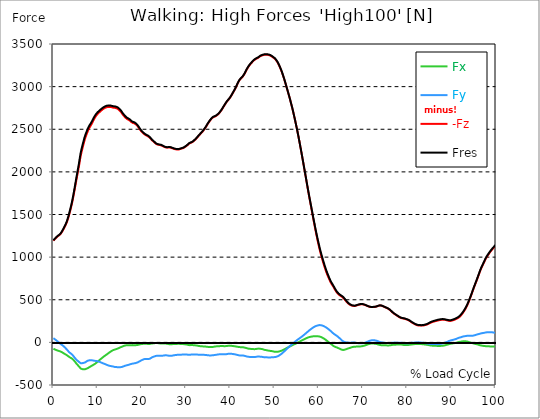
| Category |  Fx |  Fy |  -Fz |  Fres |
|---|---|---|---|---|
| 0.0 | -74.852 | 49.614 | 1192.858 | 1197.875 |
| 0.1647276845464841 | -78.674 | 42.86 | 1202.476 | 1207.298 |
| 0.3294553690929682 | -82.621 | 36.189 | 1210.884 | 1215.762 |
| 0.5044785339236075 | -86.387 | 29.838 | 1220.278 | 1225.226 |
| 0.6692062184700917 | -90.056 | 23.626 | 1230.09 | 1235.121 |
| 0.8339339030165757 | -93.517 | 16.302 | 1237.803 | 1242.945 |
| 0.9986615875630598 | -96.741 | 8.408 | 1245.294 | 1250.631 |
| 1.1633892721095438 | -99.965 | 0.264 | 1251.979 | 1257.468 |
| 1.3384124369401833 | -102.397 | -6.518 | 1256.899 | 1262.597 |
| 1.5031401214866673 | -105.163 | -12.814 | 1264.473 | 1270.49 |
| 1.6678678060331513 | -108.304 | -19.762 | 1273.742 | 1280.121 |
| 1.8325954905796356 | -112.293 | -26.531 | 1285.041 | 1291.768 |
| 1.9973231751261196 | -117.046 | -32.034 | 1300.579 | 1307.722 |
| 2.1620508596726036 | -122.771 | -38.594 | 1316.311 | 1323.927 |
| 2.337074024503243 | -128.344 | -45.932 | 1332.098 | 1340.242 |
| 2.501801709049727 | -133.5 | -54.089 | 1348.206 | 1356.947 |
| 2.666529393596211 | -138.295 | -62.692 | 1364.702 | 1374.041 |
| 2.8312570781426953 | -143.451 | -71.864 | 1383.339 | 1393.512 |
| 2.9959847626891793 | -148.704 | -81.176 | 1403.046 | 1414.108 |
| 3.1710079275198186 | -154.305 | -90.362 | 1427.116 | 1439.124 |
| 3.3357356120663026 | -161.073 | -100.549 | 1455.412 | 1468.462 |
| 3.500463296612787 | -168.536 | -112.32 | 1483.666 | 1497.98 |
| 3.665190981159271 | -174.165 | -119.908 | 1516.269 | 1531.459 |
| 3.8299186657057547 | -178.64 | -126.065 | 1549.79 | 1565.703 |
| 4.004941830536394 | -183.281 | -132.347 | 1584.34 | 1601.003 |
| 4.169669515082878 | -188.16 | -138.726 | 1620.446 | 1637.873 |
| 4.334397199629363 | -194.872 | -147.773 | 1661.013 | 1679.58 |
| 4.499124884175846 | -203.002 | -158.585 | 1704.679 | 1724.692 |
| 4.663852568722331 | -213.3 | -170.051 | 1750.722 | 1772.541 |
| 4.8285802532688145 | -223.251 | -180.53 | 1797.279 | 1820.738 |
| 5.003603418099454 | -234.174 | -190.439 | 1846.004 | 1871.228 |
| 5.168331102645938 | -246.043 | -201.126 | 1894.937 | 1922.079 |
| 5.333058787192422 | -255.966 | -209.228 | 1941.091 | 1969.692 |
| 5.497786471738906 | -265.764 | -216.413 | 1987.342 | 2017.333 |
| 5.662514156285391 | -275.242 | -223.154 | 2033.427 | 2064.71 |
| 5.83753732111603 | -285.137 | -230.533 | 2081.429 | 2114.088 |
| 6.0022650056625135 | -296.561 | -238.622 | 2136.116 | 2170.262 |
| 6.166992690208998 | -305.636 | -244.348 | 2185.063 | 2220.349 |
| 6.331720374755482 | -310.041 | -245.07 | 2225.061 | 2260.458 |
| 6.496448059301967 | -313.405 | -244.473 | 2261.458 | 2296.731 |
| 6.671471224132605 | -314.989 | -242.332 | 2294.59 | 2329.487 |
| 6.836198908679089 | -315.684 | -240.373 | 2327.847 | 2362.174 |
| 7.000926593225574 | -316.559 | -238.677 | 2361.73 | 2395.542 |
| 7.165654277772057 | -315.573 | -235.258 | 2390.859 | 2423.796 |
| 7.330381962318542 | -312.64 | -230.158 | 2415.583 | 2447.325 |
| 7.495109646865026 | -308.332 | -223.473 | 2439.236 | 2469.505 |
| 7.670132811695664 | -304.149 | -217.47 | 2462.362 | 2491.269 |
| 7.8348604962421495 | -300.369 | -213.648 | 2483.681 | 2511.601 |
| 7.999588180788634 | -295.588 | -211.452 | 2502.665 | 2529.682 |
| 8.164315865335118 | -290.126 | -210.507 | 2519.134 | 2545.345 |
| 8.329043549881602 | -284.817 | -209.604 | 2533.143 | 2558.603 |
| 8.504066714712243 | -279.842 | -209.659 | 2547.721 | 2572.556 |
| 8.668794399258726 | -275.047 | -210.618 | 2563.87 | 2588.163 |
| 8.833522083805208 | -269.919 | -211.007 | 2581.52 | 2605.132 |
| 8.998249768351693 | -265.041 | -212.883 | 2599.073 | 2622.17 |
| 9.162977452898177 | -260.107 | -214.954 | 2615.736 | 2638.375 |
| 9.338000617728817 | -254.715 | -216.316 | 2631.134 | 2653.232 |
| 9.5027283022753 | -248.781 | -217.136 | 2645.129 | 2666.615 |
| 9.667455986821786 | -242.471 | -218.623 | 2658.263 | 2679.192 |
| 9.83218367136827 | -235.078 | -220.082 | 2669.353 | 2689.685 |
| 9.996911355914754 | -227.365 | -221.792 | 2679.109 | 2698.885 |
| 10.171934520745392 | -219.582 | -223.751 | 2687.837 | 2707.126 |
| 10.336662205291876 | -211.869 | -226.03 | 2696.314 | 2715.145 |
| 10.501389889838359 | -204.295 | -228.713 | 2704.681 | 2723.081 |
| 10.666117574384844 | -197.151 | -232.576 | 2712.644 | 2730.78 |
| 10.830845258931328 | -190.202 | -236.996 | 2720.176 | 2738.132 |
| 10.995572943477812 | -183.17 | -241.026 | 2727.222 | 2744.984 |
| 11.170596108308452 | -176.124 | -244.695 | 2733.963 | 2751.529 |
| 11.335323792854936 | -169.05 | -248.072 | 2740.647 | 2757.992 |
| 11.50005147740142 | -162.366 | -250.81 | 2745.956 | 2763.106 |
| 11.664779161947905 | -156.195 | -254.076 | 2750.473 | 2767.512 |
| 11.829506846494388 | -150.233 | -257.884 | 2754.879 | 2771.875 |
| 12.004530011325027 | -144.313 | -261.997 | 2757.686 | 2774.738 |
| 12.169257695871512 | -137.878 | -265.611 | 2759.59 | 2776.628 |
| 12.333985380417996 | -131.499 | -268.932 | 2761.049 | 2778.06 |
| 12.498713064964479 | -124.842 | -271.879 | 2761.994 | 2778.935 |
| 12.663440749510965 | -118.227 | -274.491 | 2762.411 | 2779.241 |
| 12.838463914341604 | -112.223 | -276.381 | 2762.022 | 2778.755 |
| 13.003191598888087 | -106.595 | -277.577 | 2760.743 | 2777.337 |
| 13.167919283434573 | -101.049 | -279.675 | 2758.534 | 2775.114 |
| 13.332646967981058 | -95.824 | -280.592 | 2756.116 | 2772.584 |
| 13.497374652527538 | -91.113 | -282.705 | 2753.961 | 2770.486 |
| 13.662102337074025 | -87.805 | -285.471 | 2752.544 | 2769.235 |
| 13.837125501904662 | -85.081 | -288.222 | 2751.946 | 2768.818 |
| 14.001853186451148 | -82.566 | -289.251 | 2750.237 | 2767.164 |
| 14.166580870997631 | -79.911 | -290.182 | 2748.18 | 2765.121 |
| 14.331308555544114 | -76.576 | -291.196 | 2744.942 | 2761.911 |
| 14.4960362400906 | -73.796 | -290.488 | 2740.675 | 2757.505 |
| 14.671059404921238 | -71.114 | -291.196 | 2735.394 | 2752.252 |
| 14.835787089467724 | -66 | -291.488 | 2727.653 | 2744.414 |
| 15.000514774014206 | -60.594 | -291.683 | 2719.481 | 2736.145 |
| 15.165242458560689 | -57.619 | -291.002 | 2709.475 | 2726.055 |
| 15.329970143107175 | -54.645 | -290.307 | 2699.455 | 2715.951 |
| 15.504993307937815 | -50.629 | -288.042 | 2686.697 | 2702.943 |
| 15.669720992484299 | -46.821 | -285.54 | 2674.134 | 2690.102 |
| 15.834448677030782 | -43.625 | -282.01 | 2663.099 | 2678.678 |
| 15.999176361577268 | -40.72 | -277.952 | 2653.079 | 2668.241 |
| 16.16390404612375 | -37.259 | -274.964 | 2643.531 | 2658.374 |
| 16.33892721095439 | -35.036 | -272.393 | 2634.79 | 2649.382 |
| 16.503654895500876 | -34.355 | -270.169 | 2626.687 | 2641.085 |
| 16.668382580047357 | -34.369 | -268.349 | 2620.197 | 2634.456 |
| 16.833110264593845 | -34.258 | -265.68 | 2615.333 | 2629.369 |
| 16.997837949140326 | -34.549 | -262.998 | 2611.372 | 2625.186 |
| 17.16256563368681 | -34.813 | -260.427 | 2606.897 | 2620.503 |
| 17.33758879851745 | -34.661 | -258.009 | 2600.157 | 2613.54 |
| 17.502316483063932 | -34.341 | -254.771 | 2591.971 | 2605.09 |
| 17.667044167610417 | -32.923 | -251.936 | 2583.48 | 2596.349 |
| 17.8317718521569 | -32.131 | -249.809 | 2578.004 | 2590.665 |
| 17.996499536703386 | -32.91 | -247.655 | 2573.807 | 2586.287 |
| 18.171522701534023 | -33.882 | -246.932 | 2570.93 | 2583.382 |
| 18.33625038608051 | -34.869 | -246.919 | 2568.901 | 2581.395 |
| 18.500978070626992 | -34.271 | -244.153 | 2562.758 | 2575.016 |
| 18.665705755173477 | -33.34 | -241.234 | 2556.213 | 2568.22 |
| 18.83043343971996 | -31.506 | -238.844 | 2549.361 | 2561.132 |
| 19.0054566045506 | -30.422 | -235.592 | 2539.41 | 2550.931 |
| 19.170184289097087 | -28.865 | -231.895 | 2527.639 | 2538.854 |
| 19.33491197364357 | -27.114 | -227.643 | 2515.298 | 2526.166 |
| 19.499639658190056 | -24.279 | -222.084 | 2502.234 | 2512.616 |
| 19.66436734273654 | -21.917 | -217.094 | 2490.143 | 2500.094 |
| 19.82909502728302 | -20.402 | -212.675 | 2479.192 | 2488.781 |
| 20.004118192113662 | -19.345 | -208.603 | 2469.63 | 2478.872 |
| 20.168845876660146 | -18.025 | -204.267 | 2460.597 | 2469.478 |
| 20.33357356120663 | -17.011 | -200.139 | 2452.397 | 2460.958 |
| 20.49830124575311 | -15.913 | -196.901 | 2445.463 | 2453.773 |
| 20.663028930299596 | -15.065 | -194.928 | 2438.861 | 2447.005 |
| 20.838052095130234 | -14.523 | -194.747 | 2432.552 | 2440.682 |
| 21.002779779676718 | -15.649 | -195.094 | 2427.743 | 2435.915 |
| 21.167507464223206 | -17.066 | -195.789 | 2423.213 | 2431.482 |
| 21.332235148769687 | -18.498 | -196.72 | 2418.89 | 2427.243 |
| 21.496962833316175 | -19.165 | -196.095 | 2413.484 | 2421.809 |
| 21.671985998146813 | -19.123 | -194.274 | 2406.827 | 2415.013 |
| 21.836713682693297 | -18.122 | -191.161 | 2398.419 | 2406.383 |
| 22.00144136723978 | -16.566 | -186.631 | 2388.844 | 2396.46 |
| 22.166169051786262 | -14.078 | -180.294 | 2378.587 | 2385.717 |
| 22.33089673633275 | -12.285 | -174.721 | 2369.318 | 2376.016 |
| 22.505919901163388 | -12.216 | -171.079 | 2362.424 | 2368.887 |
| 22.670647585709872 | -11.368 | -168.355 | 2355.225 | 2361.507 |
| 22.835375270256357 | -10.02 | -165.506 | 2347.457 | 2353.558 |
| 23.00010295480284 | -8.339 | -162.338 | 2339.035 | 2344.955 |
| 23.164830639349326 | -7.352 | -159.002 | 2330.529 | 2336.269 |
| 23.32955832389581 | -7.38 | -157.696 | 2325.248 | 2330.905 |
| 23.50458148872645 | -7.894 | -156.987 | 2321.385 | 2327.013 |
| 23.66930917327293 | -8.881 | -156.932 | 2319.106 | 2324.734 |
| 23.834036857819417 | -10.076 | -157.112 | 2317.16 | 2322.816 |
| 23.998764542365898 | -11.632 | -157.335 | 2315.478 | 2321.162 |
| 24.163492226912382 | -12.953 | -157.585 | 2313.588 | 2319.3 |
| 24.338515391743023 | -14.05 | -157.821 | 2311.879 | 2317.605 |
| 24.503243076289504 | -14.176 | -157.237 | 2308.293 | 2313.991 |
| 24.667970760835992 | -14.148 | -156.153 | 2303.86 | 2309.489 |
| 24.832698445382476 | -14.217 | -155.222 | 2299.927 | 2305.5 |
| 24.997426129928957 | -13.661 | -153.527 | 2294.674 | 2300.135 |
| 25.1724492947596 | -13.773 | -152.443 | 2290.838 | 2296.244 |
| 25.337176979306086 | -14.273 | -152.026 | 2287.85 | 2293.228 |
| 25.501904663852567 | -14.829 | -151.845 | 2285.07 | 2290.435 |
| 25.66663234839905 | -15.927 | -152.345 | 2284.181 | 2289.601 |
| 25.831360032945536 | -17.414 | -153.68 | 2284.25 | 2289.768 |
| 25.99608771749202 | -19.165 | -155.57 | 2285.029 | 2290.685 |
| 26.171110882322658 | -20.958 | -157.613 | 2286.085 | 2291.894 |
| 26.335838566869146 | -22.181 | -158.669 | 2286.085 | 2291.978 |
| 26.50056625141563 | -22.306 | -158.224 | 2284.223 | 2290.087 |
| 26.665293935962115 | -21.958 | -157.223 | 2281.443 | 2287.225 |
| 26.830021620508592 | -21.277 | -156.056 | 2278.427 | 2284.139 |
| 27.00504478533923 | -20.096 | -154.402 | 2275.009 | 2280.595 |
| 27.169772469885718 | -19.179 | -152.332 | 2271.618 | 2277.065 |
| 27.334500154432202 | -18.956 | -150.858 | 2268.824 | 2274.203 |
| 27.499227838978687 | -18.47 | -149.413 | 2266.309 | 2271.604 |
| 27.66395552352517 | -18.011 | -147.829 | 2264.849 | 2270.047 |
| 27.83897868835581 | -18.206 | -147.301 | 2264.196 | 2269.366 |
| 28.003706372902297 | -17.65 | -146.092 | 2262.612 | 2267.712 |
| 28.168434057448778 | -17.247 | -145.119 | 2261.806 | 2266.837 |
| 28.333161741995262 | -17.289 | -144.479 | 2262.612 | 2267.601 |
| 28.497889426541747 | -17.497 | -143.785 | 2264.571 | 2269.505 |
| 28.662617111088228 | -18.234 | -144.299 | 2268.018 | 2272.98 |
| 28.837640275918872 | -18.984 | -144.813 | 2271.451 | 2276.44 |
| 29.002367960465357 | -19.22 | -144.132 | 2273.925 | 2278.872 |
| 29.167095645011837 | -19.276 | -143.02 | 2276.232 | 2281.096 |
| 29.331823329558322 | -19.206 | -141.478 | 2278.566 | 2283.347 |
| 29.496551014104806 | -20.832 | -142.047 | 2283.347 | 2288.17 |
| 29.671574178935447 | -21.805 | -142.131 | 2288.6 | 2293.423 |
| 29.836301863481932 | -22.931 | -142.27 | 2294.187 | 2299.01 |
| 30.001029548028413 | -24.446 | -142.589 | 2300.664 | 2305.5 |
| 30.165757232574894 | -25.711 | -142.853 | 2306.626 | 2311.476 |
| 30.330484917121378 | -27.476 | -143.798 | 2314.2 | 2319.12 |
| 30.505508081952023 | -29.602 | -145.035 | 2322.886 | 2327.917 |
| 30.670235766498504 | -31.492 | -145.953 | 2331.266 | 2336.38 |
| 30.834963451044988 | -32.562 | -146.092 | 2336.686 | 2341.828 |
| 30.999691135591473 | -32.145 | -144.549 | 2339.646 | 2344.691 |
| 31.16441882013796 | -31.395 | -142.784 | 2342.051 | 2346.943 |
| 31.339441984968598 | -31.2 | -141.63 | 2346.192 | 2351.015 |
| 31.50416966951508 | -31.964 | -141.269 | 2351.946 | 2356.74 |
| 31.668897354061563 | -32.59 | -141.464 | 2358.352 | 2363.161 |
| 31.833625038608048 | -33.326 | -141.366 | 2366.024 | 2370.846 |
| 31.998352723154536 | -34.341 | -141.408 | 2374.418 | 2379.254 |
| 32.16308040770102 | -35.369 | -141.964 | 2383.174 | 2388.052 |
| 32.33810357253166 | -36.412 | -142.534 | 2391.846 | 2396.765 |
| 32.502831257078135 | -37.69 | -143.048 | 2401.366 | 2406.313 |
| 32.66755894162463 | -39.483 | -143.896 | 2411.511 | 2416.542 |
| 32.83228662617111 | -41.318 | -144.73 | 2421.684 | 2426.784 |
| 32.99701431071759 | -43.069 | -145.369 | 2431.218 | 2436.387 |
| 33.17203747554823 | -44.597 | -145.786 | 2440.988 | 2446.199 |
| 33.336765160094714 | -45.667 | -146.119 | 2449.924 | 2455.163 |
| 33.5014928446412 | -46.432 | -146.425 | 2458.415 | 2463.682 |
| 33.66622052918769 | -46.752 | -146.328 | 2468.463 | 2473.716 |
| 33.83094821373417 | -47.043 | -146.175 | 2479.373 | 2484.598 |
| 34.00597137856481 | -47.544 | -146.314 | 2490.824 | 2496.064 |
| 34.17069906311129 | -48.266 | -146.675 | 2502.748 | 2508.002 |
| 34.33542674765778 | -49.197 | -146.925 | 2514.686 | 2519.954 |
| 34.50015443220426 | -50.031 | -147.704 | 2527.194 | 2532.489 |
| 34.664882116750746 | -51.227 | -149.288 | 2541.828 | 2547.193 |
| 34.829609801297224 | -52.491 | -150.9 | 2557.185 | 2562.605 |
| 35.004632966127865 | -53.242 | -151.762 | 2570.388 | 2575.822 |
| 35.169360650674356 | -53.867 | -152.484 | 2582.493 | 2587.941 |
| 35.334088335220834 | -54.215 | -152.818 | 2595.154 | 2600.615 |
| 35.49881601976732 | -54.645 | -152.818 | 2607.495 | 2612.929 |
| 35.6635437043138 | -54.743 | -152.609 | 2618.46 | 2623.838 |
| 35.838566869144444 | -54.618 | -152.373 | 2627.841 | 2633.191 |
| 36.00329455369093 | -54.187 | -152.262 | 2636.513 | 2641.808 |
| 36.16802223823741 | -52.686 | -150.733 | 2642.35 | 2647.52 |
| 36.3327499227839 | -50.824 | -148.996 | 2646.213 | 2651.23 |
| 36.497477607330374 | -48.92 | -147.606 | 2648.59 | 2653.496 |
| 36.67250077216102 | -47.961 | -146.828 | 2653.259 | 2658.096 |
| 36.83722845670751 | -46.918 | -145.48 | 2657.985 | 2662.738 |
| 37.001956141253984 | -45.945 | -143.659 | 2663.752 | 2668.394 |
| 37.166683825800476 | -45.348 | -142.242 | 2671.882 | 2676.455 |
| 37.33141151034695 | -45.278 | -141.241 | 2679.637 | 2684.14 |
| 37.496139194893445 | -44.542 | -140.171 | 2688.907 | 2693.312 |
| 37.671162359724086 | -43.791 | -139.407 | 2699.372 | 2703.722 |
| 37.83589004427056 | -43.305 | -139.198 | 2711.602 | 2715.91 |
| 38.00061772881704 | -43.083 | -138.754 | 2724.012 | 2728.293 |
| 38.16534541336353 | -42.944 | -138.517 | 2736.992 | 2741.273 |
| 38.33007309791002 | -43.402 | -138.781 | 2751.307 | 2755.601 |
| 38.50509626274065 | -44.014 | -139.045 | 2765.635 | 2769.93 |
| 38.66982394728714 | -44.139 | -138.99 | 2779.227 | 2783.494 |
| 38.83455163183362 | -44.167 | -138.948 | 2792.805 | 2797.03 |
| 38.99927931638011 | -44.028 | -138.642 | 2806.55 | 2810.733 |
| 39.16400700092659 | -43.527 | -137.948 | 2819.905 | 2824.019 |
| 39.33903016575723 | -41.818 | -136.502 | 2830.912 | 2834.97 |
| 39.503757850303714 | -39.956 | -134.584 | 2840.71 | 2844.657 |
| 39.6684855348502 | -38.288 | -132.597 | 2850.466 | 2854.288 |
| 39.83321321939669 | -38.052 | -131.985 | 2861.835 | 2865.587 |
| 39.99794090394317 | -38.58 | -132.166 | 2874.162 | 2877.886 |
| 40.1729640687738 | -39.747 | -133.361 | 2888.198 | 2891.978 |
| 40.33769175332029 | -40.762 | -134.07 | 2902.402 | 2906.196 |
| 40.50241943786678 | -42.193 | -135.668 | 2917.689 | 2921.539 |
| 40.66714712241326 | -43.402 | -137.211 | 2933.032 | 2936.951 |
| 40.831874806959746 | -44.611 | -138.615 | 2948.43 | 2952.419 |
| 40.99660249150622 | -45.362 | -139.254 | 2963.398 | 2967.401 |
| 41.17162565633686 | -46.932 | -141.283 | 2979.742 | 2983.855 |
| 41.336353340883356 | -48.711 | -143.632 | 2997.517 | 3001.728 |
| 41.50108102542983 | -50.295 | -146.175 | 3016.946 | 3021.282 |
| 41.66580870997632 | -51.88 | -148.76 | 3036.472 | 3040.919 |
| 41.8305363945228 | -53.172 | -150.719 | 3053.607 | 3058.152 |
| 42.005559559353436 | -54.312 | -152.332 | 3069.187 | 3073.801 |
| 42.17028724389993 | -55.674 | -153.805 | 3081.014 | 3085.683 |
| 42.33501492844641 | -56.577 | -154.5 | 3091.868 | 3096.565 |
| 42.4997426129929 | -56.522 | -154.249 | 3101.054 | 3105.737 |
| 42.664470297539374 | -56.257 | -153.805 | 3109.643 | 3114.284 |
| 42.839493462370015 | -56.299 | -153.388 | 3118.245 | 3122.873 |
| 43.00422114691651 | -58.356 | -155.417 | 3131.253 | 3135.992 |
| 43.168948831462984 | -60.385 | -157.418 | 3144.998 | 3149.862 |
| 43.33367651600947 | -62.497 | -159.433 | 3160.133 | 3165.122 |
| 43.49840420055595 | -64.93 | -162.046 | 3177.004 | 3182.16 |
| 43.66313188510244 | -67.459 | -164.742 | 3195.154 | 3200.477 |
| 43.83815504993308 | -69.683 | -166.646 | 3210.192 | 3215.64 |
| 44.00288273447956 | -71.934 | -168.05 | 3224.145 | 3229.704 |
| 44.16761041902604 | -74.102 | -169.453 | 3237.653 | 3243.324 |
| 44.332338103572525 | -75.464 | -170.649 | 3249.98 | 3255.72 |
| 44.49706578811901 | -76.034 | -171.066 | 3260.765 | 3266.519 |
| 44.67208895294965 | -76.381 | -170.927 | 3270.618 | 3276.358 |
| 44.836816637496135 | -76.909 | -170.704 | 3280.319 | 3286.031 |
| 45.00154432204262 | -77.66 | -170.801 | 3290.075 | 3295.815 |
| 45.166272006589104 | -78.758 | -171.538 | 3299.178 | 3304.987 |
| 45.33099969113559 | -79.717 | -172.177 | 3307.572 | 3313.437 |
| 45.50602285596623 | -79.744 | -171.885 | 3314.382 | 3320.233 |
| 45.670750540512714 | -78.911 | -170.815 | 3320.372 | 3326.153 |
| 45.83547822505919 | -77.715 | -169.578 | 3326.139 | 3331.823 |
| 46.00020590960568 | -76.228 | -168.383 | 3330.753 | 3336.312 |
| 46.16493359415217 | -74.102 | -166.646 | 3333.936 | 3339.356 |
| 46.3399567589828 | -73.268 | -166.215 | 3339.189 | 3344.54 |
| 46.50468444352929 | -72.851 | -166.007 | 3346.068 | 3351.377 |
| 46.66941212807577 | -73.921 | -166.632 | 3352.864 | 3358.243 |
| 46.83413981262226 | -75.923 | -168.258 | 3358.354 | 3363.871 |
| 46.99886749716874 | -76.881 | -169.064 | 3362.426 | 3367.985 |
| 47.16359518171523 | -78.049 | -169.676 | 3365.831 | 3371.418 |
| 47.33861834654586 | -80.425 | -170.954 | 3368.652 | 3374.336 |
| 47.50334603109235 | -83.358 | -172.886 | 3370.917 | 3376.727 |
| 47.66807371563883 | -86.137 | -174.568 | 3372.377 | 3378.297 |
| 47.83280140018532 | -88.75 | -176.055 | 3373.752 | 3379.77 |
| 47.997529084731795 | -90.362 | -176.277 | 3374.461 | 3380.534 |
| 48.172552249562436 | -91.279 | -175.499 | 3374.017 | 3380.09 |
| 48.33727993410892 | -93.044 | -175.471 | 3373.224 | 3379.325 |
| 48.502007618655405 | -95.532 | -176.208 | 3373.53 | 3379.701 |
| 48.6667353032019 | -96.95 | -176.277 | 3371.181 | 3377.394 |
| 48.831462987748374 | -98.256 | -176.166 | 3368.277 | 3374.517 |
| 49.00648615257901 | -99.576 | -176.041 | 3365.372 | 3371.626 |
| 49.17121383712551 | -101.174 | -176.124 | 3361.745 | 3368.054 |
| 49.335941521671984 | -102.133 | -174.999 | 3355.964 | 3362.245 |
| 49.50066920621847 | -103.231 | -173.539 | 3348.904 | 3355.157 |
| 49.66539689076495 | -105.246 | -173.122 | 3343.011 | 3349.307 |
| 49.83012457531144 | -107.79 | -173.553 | 3338.189 | 3344.581 |
| 50.00514774014208 | -109.305 | -173.039 | 3331.045 | 3337.48 |
| 50.16987542468856 | -110.361 | -171.927 | 3322.109 | 3328.53 |
| 50.33460310923505 | -110.903 | -169.954 | 3311.352 | 3317.703 |
| 50.499330793781525 | -110.986 | -167.452 | 3299.247 | 3305.515 |
| 50.66405847832801 | -110.361 | -164.311 | 3285.461 | 3291.59 |
| 50.83908164315865 | -109.152 | -160.392 | 3270.771 | 3276.719 |
| 51.003809327705135 | -107.137 | -155.264 | 3252.649 | 3258.333 |
| 51.16853701225162 | -104.413 | -149.427 | 3233.581 | 3238.974 |
| 51.3332646967981 | -101.619 | -143.534 | 3213.819 | 3218.905 |
| 51.49799238134458 | -99.215 | -138.003 | 3193.181 | 3197.99 |
| 51.67301554617522 | -96.088 | -131.332 | 3170.055 | 3174.558 |
| 51.837743230721706 | -91.71 | -123.063 | 3144.845 | 3148.945 |
| 52.00247091526819 | -87.833 | -115.572 | 3118.996 | 3122.762 |
| 52.16719859981468 | -83.163 | -107.359 | 3092.229 | 3095.606 |
| 52.33192628436116 | -78.508 | -99.09 | 3064.197 | 3067.213 |
| 52.5069494491918 | -73.963 | -90.96 | 3034.498 | 3037.167 |
| 52.67167713373829 | -69.321 | -82.607 | 3004.744 | 3007.078 |
| 52.83640481828477 | -64.652 | -74.283 | 2974.947 | 2976.948 |
| 53.00113250283126 | -60.038 | -65.847 | 2945.234 | 2946.943 |
| 53.16586018737774 | -55.729 | -58.009 | 2915.215 | 2916.661 |
| 53.33058787192423 | -51.602 | -50.087 | 2884.46 | 2885.724 |
| 53.50561103675487 | -46.877 | -41.734 | 2852.926 | 2853.996 |
| 53.67033872130134 | -42.666 | -34.285 | 2819.655 | 2820.642 |
| 53.83506640584783 | -38.635 | -26.989 | 2786.246 | 2787.121 |
| 53.99979409039431 | -34.827 | -19.804 | 2752.474 | 2753.253 |
| 54.164521774940795 | -30.45 | -12.355 | 2716.869 | 2717.564 |
| 54.339544939771436 | -26.044 | -4.767 | 2679.456 | 2680.096 |
| 54.50427262431792 | -21.903 | 2.418 | 2641.516 | 2642.114 |
| 54.669000308864405 | -17.775 | 9.256 | 2602.366 | 2602.936 |
| 54.83372799341089 | -13.522 | 16.01 | 2562.161 | 2562.744 |
| 54.998455677957374 | -9.186 | 22.778 | 2521.191 | 2521.802 |
| 55.173478842788015 | -4.934 | 29.254 | 2479.373 | 2480.04 |
| 55.3382065273345 | -0.556 | 35.314 | 2435.957 | 2436.721 |
| 55.502934211880984 | 3.794 | 41.79 | 2391.262 | 2392.138 |
| 55.66766189642746 | 8.436 | 48.127 | 2345.525 | 2346.526 |
| 55.83238958097395 | 12.925 | 54.298 | 2298.801 | 2299.983 |
| 55.997117265520444 | 17.344 | 60.524 | 2252.133 | 2253.537 |
| 56.17214043035107 | 21.847 | 67.111 | 2204.534 | 2206.188 |
| 56.336868114897555 | 26.378 | 73.782 | 2156.115 | 2158.06 |
| 56.50159579944404 | 30.825 | 80.606 | 2107.001 | 2109.294 |
| 56.666323483990524 | 35.258 | 87.666 | 2057.47 | 2060.221 |
| 56.83105116853701 | 39.831 | 94.99 | 2008.216 | 2011.413 |
| 57.00607433336764 | 44.167 | 102.175 | 1959.255 | 1962.938 |
| 57.170802017914134 | 48.211 | 109.68 | 1909.307 | 1913.685 |
| 57.33552970246061 | 51.921 | 117.31 | 1859.22 | 1864.293 |
| 57.5002573870071 | 55.396 | 124.787 | 1809.258 | 1815.109 |
| 57.66498507155359 | 58.606 | 131.999 | 1760.311 | 1766.926 |
| 57.84000823638422 | 61.552 | 139.393 | 1712.489 | 1719.98 |
| 58.00473592093071 | 63.846 | 146.425 | 1665.613 | 1674.063 |
| 58.16946360547718 | 65.666 | 153.04 | 1619.556 | 1628.965 |
| 58.334191290023675 | 67.278 | 159.35 | 1573.402 | 1583.77 |
| 58.49891897457017 | 68.904 | 165.757 | 1526.415 | 1537.866 |
| 58.663646659116644 | 70.364 | 171.872 | 1479.663 | 1492.199 |
| 58.838669823947285 | 71.545 | 177.653 | 1433.342 | 1446.976 |
| 59.00339750849377 | 72.281 | 182.795 | 1387.605 | 1402.392 |
| 59.168125193040254 | 72.74 | 187.409 | 1342.397 | 1358.323 |
| 59.33285287758674 | 72.74 | 191.175 | 1298.494 | 1315.435 |
| 59.49758056213322 | 72.254 | 194.122 | 1256.231 | 1274.132 |
| 59.672603726963864 | 71.892 | 197.179 | 1215.108 | 1233.981 |
| 59.83733141151035 | 71.114 | 199.375 | 1174.555 | 1194.373 |
| 60.002059096056826 | 69.877 | 200.987 | 1136.073 | 1156.683 |
| 60.16678678060332 | 68.682 | 202.696 | 1098.716 | 1120.146 |
| 60.33151446514979 | 66.861 | 203.322 | 1062.971 | 1084.971 |
| 60.506537629980436 | 63.373 | 201.96 | 1030.104 | 1052.284 |
| 60.67126531452693 | 58.954 | 199.222 | 998.834 | 1020.89 |
| 60.8359929990734 | 54.618 | 196.804 | 968.204 | 990.204 |
| 61.00072068361989 | 49.573 | 193.232 | 938.838 | 960.546 |
| 61.165448368166366 | 44.57 | 189.605 | 910.265 | 931.681 |
| 61.34047153299701 | 39.094 | 185.13 | 882.595 | 903.524 |
| 61.5051992175435 | 33.201 | 180.349 | 856.509 | 876.855 |
| 61.669926902089976 | 26.558 | 174.957 | 832.063 | 851.617 |
| 61.83465458663647 | 19.554 | 169.273 | 808.507 | 827.268 |
| 61.999382271182945 | 12.48 | 162.866 | 786.437 | 804.448 |
| 62.16410995572944 | 5.768 | 156.556 | 765.813 | 783.046 |
| 62.33913312056008 | -1.279 | 149.649 | 745.703 | 762.116 |
| 62.50386080510655 | -8.366 | 142.172 | 726.844 | 742.312 |
| 62.66858848965305 | -15.107 | 135.238 | 708.43 | 723.134 |
| 62.83331617419952 | -21.041 | 128.066 | 692.712 | 706.818 |
| 62.998043858746 | -28.031 | 119.825 | 678.356 | 691.572 |
| 63.17306702357666 | -35.578 | 111.222 | 664.861 | 677.397 |
| 63.33779470812313 | -42.457 | 103.287 | 650.922 | 662.943 |
| 63.50252239266961 | -47.53 | 96.866 | 635.704 | 647.267 |
| 63.667250077216096 | -50.893 | 91.391 | 620.403 | 631.66 |
| 63.83197776176258 | -55.048 | 85.609 | 605.671 | 616.595 |
| 64.00700092659322 | -57.55 | 80.064 | 592.121 | 602.669 |
| 64.1717286111397 | -60.538 | 73.782 | 580.711 | 590.745 |
| 64.33645629568619 | -64.916 | 66.472 | 571.4 | 580.989 |
| 64.50118398023267 | -68.988 | 58.995 | 563.2 | 572.581 |
| 64.66591166477916 | -72.434 | 51.838 | 555.723 | 565.035 |
| 64.83063934932565 | -76.687 | 44.194 | 549.191 | 558.433 |
| 65.00566251415627 | -80.953 | 35.731 | 543.132 | 552.416 |
| 65.17039019870276 | -85.234 | 26.822 | 538.184 | 547.343 |
| 65.33511788324925 | -88.82 | 18.22 | 533.167 | 542.159 |
| 65.49984556779573 | -89.264 | 12.146 | 525.232 | 534.307 |
| 65.66457325234222 | -88.222 | 7.519 | 515.99 | 524.996 |
| 65.83959641717286 | -86.054 | 4.572 | 505.511 | 514.253 |
| 66.00432410171935 | -83.511 | 1.987 | 494.879 | 503.399 |
| 66.16905178626584 | -80.815 | -0.5 | 484.276 | 492.517 |
| 66.3337794708123 | -77.701 | -2.057 | 474.561 | 482.316 |
| 66.4985071553588 | -74.032 | -2.404 | 465.278 | 472.449 |
| 66.67353032018943 | -70.753 | -2.891 | 456.828 | 463.471 |
| 66.83825800473592 | -67.848 | -3.377 | 449.434 | 455.577 |
| 67.0029856892824 | -65.555 | -4.072 | 443.722 | 449.448 |
| 67.16771337382887 | -63.234 | -4.461 | 438.747 | 444.084 |
| 67.33244105837538 | -59.218 | -2.14 | 433.772 | 438.511 |
| 67.49716874292186 | -56.577 | -1.515 | 431.201 | 435.578 |
| 67.67219190775249 | -54.52 | -1.431 | 429.158 | 433.271 |
| 67.83691959229898 | -52.727 | -1.265 | 427.907 | 431.812 |
| 68.00164727684546 | -51.463 | -1.876 | 427.115 | 430.812 |
| 68.16637496139195 | -50.573 | -2.946 | 426.948 | 430.506 |
| 68.33110264593842 | -50.184 | -4.697 | 428.949 | 432.521 |
| 68.50612581076906 | -49.739 | -6.24 | 431.826 | 435.37 |
| 68.67085349531555 | -49.336 | -7.338 | 434.995 | 438.525 |
| 68.83558117986203 | -48.92 | -8.769 | 438.469 | 441.971 |
| 69.00030886440852 | -48.642 | -9.923 | 440.985 | 444.473 |
| 69.165036548955 | -48.155 | -10.59 | 442.75 | 446.252 |
| 69.34005971378564 | -47.182 | -10.173 | 444.501 | 447.919 |
| 69.50478739833213 | -46.988 | -10.896 | 446.585 | 450.018 |
| 69.66951508287862 | -46.376 | -11.299 | 447.808 | 451.199 |
| 69.8342427674251 | -44.709 | -11.035 | 446.961 | 450.185 |
| 69.99897045197157 | -42.582 | -9.687 | 445.501 | 448.475 |
| 70.17399361680222 | -40.317 | -7.81 | 443.486 | 446.238 |
| 70.33872130134871 | -37.718 | -5.587 | 441.026 | 443.528 |
| 70.50344898589518 | -34.813 | -3.002 | 438.302 | 440.554 |
| 70.66817667044167 | -31.881 | 0.347 | 434.814 | 436.885 |
| 70.83290435498816 | -28.81 | 3.558 | 431.131 | 433.049 |
| 70.99763203953464 | -25.446 | 7.546 | 426.587 | 428.532 |
| 71.17265520436527 | -22.375 | 11.146 | 423.029 | 424.905 |
| 71.33738288891176 | -19.679 | 14.634 | 420.027 | 421.862 |
| 71.50211057345825 | -17.4 | 17.983 | 417.484 | 419.346 |
| 71.66683825800473 | -15.134 | 21.152 | 415.274 | 417.095 |
| 71.83156594255121 | -13.981 | 23.112 | 414.412 | 416.205 |
| 72.00658910738186 | -13.05 | 24.362 | 413.982 | 415.816 |
| 72.17131679192833 | -13.161 | 24.71 | 414.107 | 415.941 |
| 72.33604447647483 | -13.828 | 24.64 | 414.607 | 416.386 |
| 72.5007721610213 | -14.467 | 24.515 | 415.191 | 416.914 |
| 72.6654998455678 | -15.496 | 23.876 | 416.191 | 417.817 |
| 72.84052301039843 | -16.496 | 22.903 | 417.512 | 419.082 |
| 73.0052506949449 | -17.942 | 21.027 | 419.596 | 421.111 |
| 73.1699783794914 | -20.179 | 18.136 | 422.209 | 423.682 |
| 73.33470606403789 | -22.987 | 14.467 | 425.28 | 426.823 |
| 73.49943374858437 | -26.072 | 10.312 | 428.921 | 430.686 |
| 73.66416143313084 | -28.476 | 6.838 | 431.548 | 433.397 |
| 73.83918459796149 | -30.436 | 4.044 | 432.521 | 434.453 |
| 74.00391228250797 | -31.951 | 1.96 | 432.076 | 434.119 |
| 74.16863996705446 | -33.187 | 0.111 | 430.756 | 432.868 |
| 74.33336765160095 | -34.355 | -1.737 | 428.102 | 430.297 |
| 74.49809533614743 | -34.452 | -2.627 | 424.155 | 426.489 |
| 74.67311850097806 | -34.355 | -3.322 | 419.971 | 422.459 |
| 74.83784618552455 | -34.007 | -3.794 | 415.552 | 418.137 |
| 75.00257387007105 | -34.369 | -4.864 | 411.758 | 414.412 |
| 75.16730155461751 | -34.883 | -6.31 | 408.075 | 410.813 |
| 75.332029239164 | -35.286 | -7.435 | 404.253 | 407.061 |
| 75.50705240399465 | -35.425 | -7.977 | 400.153 | 403.044 |
| 75.67178008854113 | -35.55 | -8.352 | 395.428 | 398.444 |
| 75.8365077730876 | -35.703 | -8.769 | 390.258 | 393.441 |
| 76.00123545763408 | -35.606 | -8.978 | 384.644 | 387.937 |
| 76.16596314218059 | -34.355 | -8.241 | 377.083 | 380.391 |
| 76.34098630701122 | -32.437 | -6.518 | 369.065 | 372.289 |
| 76.5057139915577 | -30.686 | -5.087 | 361.018 | 364.2 |
| 76.67044167610419 | -29.06 | -3.641 | 352.429 | 355.542 |
| 76.83516936065067 | -27.948 | -2.974 | 344.521 | 347.648 |
| 76.99989704519716 | -27.1 | -2.571 | 338.087 | 341.269 |
| 77.16462472974364 | -26.85 | -2.849 | 332.305 | 335.585 |
| 77.33964789457428 | -26.656 | -3.544 | 326.496 | 329.887 |
| 77.50437557912076 | -26.517 | -4.586 | 320.534 | 324.036 |
| 77.66910326366724 | -25.919 | -4.558 | 314.461 | 318.06 |
| 77.83383094821373 | -25.405 | -4.364 | 308.916 | 312.626 |
| 77.99855863276022 | -24.946 | -4.016 | 303.162 | 306.942 |
| 78.17358179759084 | -24.571 | -3.891 | 297.422 | 301.258 |
| 78.33830948213735 | -24.46 | -3.697 | 292.475 | 296.38 |
| 78.50303716668382 | -24.543 | -3.697 | 288.028 | 291.988 |
| 78.6677648512303 | -25.377 | -4.461 | 285.04 | 289.084 |
| 78.8324925357768 | -26.711 | -5.726 | 282.997 | 287.11 |
| 79.00751570060743 | -28.073 | -7.004 | 281.121 | 285.276 |
| 79.17224338515392 | -29.518 | -8.325 | 279.647 | 283.789 |
| 79.3369710697004 | -30.561 | -9.562 | 277.785 | 281.954 |
| 79.50169875424687 | -31.186 | -10.632 | 275.562 | 279.786 |
| 79.66642643879338 | -31.117 | -10.993 | 272.601 | 276.882 |
| 79.83115412333984 | -30.547 | -10.673 | 269.044 | 273.38 |
| 80.00617728817049 | -30.38 | -10.34 | 266.973 | 271.378 |
| 80.17090497271697 | -30.13 | -10.215 | 263.596 | 268.043 |
| 80.33563265726346 | -29.463 | -9.687 | 259.218 | 263.665 |
| 80.50036034180994 | -28.712 | -9.186 | 254.34 | 258.787 |
| 80.66508802635641 | -27.434 | -7.658 | 248.489 | 252.964 |
| 80.84011119118706 | -25.585 | -5.879 | 241.637 | 246.224 |
| 81.00483887573355 | -24.057 | -4.781 | 235.092 | 239.817 |
| 81.16956656028003 | -23.682 | -4.809 | 230.839 | 235.592 |
| 81.33429424482652 | -22.709 | -4.253 | 225.572 | 230.478 |
| 81.499021929373 | -21.555 | -3.516 | 219.971 | 225.058 |
| 81.67404509420363 | -20.277 | -2.404 | 214.551 | 219.846 |
| 81.83877277875014 | -19.526 | -1.723 | 210.229 | 215.635 |
| 82.00350046329662 | -19.04 | -1.251 | 206.449 | 211.911 |
| 82.1682281478431 | -18.4 | -0.542 | 203.072 | 208.547 |
| 82.33295583238957 | -17.65 | 0.347 | 200 | 205.462 |
| 82.50797899722022 | -17.97 | 0.111 | 198.791 | 204.253 |
| 82.67270668176671 | -18.331 | -0.25 | 197.818 | 203.294 |
| 82.83743436631318 | -18.706 | -0.792 | 197.249 | 202.738 |
| 83.00216205085967 | -19.22 | -1.543 | 196.762 | 202.266 |
| 83.16688973540616 | -19.874 | -2.488 | 196.568 | 202.071 |
| 83.33161741995264 | -20.707 | -3.461 | 196.846 | 202.28 |
| 83.50664058478327 | -21.513 | -4.475 | 197.346 | 202.71 |
| 83.67136826932976 | -22.486 | -5.615 | 198.458 | 203.822 |
| 83.83609595387625 | -23.556 | -6.713 | 200.223 | 205.615 |
| 84.00082363842272 | -24.654 | -7.783 | 202.266 | 207.713 |
| 84.16555132296921 | -25.975 | -9.256 | 204.573 | 210.02 |
| 84.34057448779986 | -27.42 | -10.924 | 207.213 | 212.8 |
| 84.50530217234633 | -28.671 | -12.202 | 210.396 | 216.135 |
| 84.67002985689282 | -29.755 | -13.105 | 213.828 | 219.79 |
| 84.83475754143929 | -31.297 | -14.412 | 218.123 | 224.404 |
| 84.9994852259858 | -33.243 | -16.274 | 222.876 | 229.547 |
| 85.17450839081643 | -35.244 | -18.553 | 227.49 | 234.647 |
| 85.3392360753629 | -36.606 | -19.679 | 231.173 | 238.65 |
| 85.5039637599094 | -37.732 | -20.29 | 234.675 | 242.402 |
| 85.66869144445587 | -38.691 | -20.402 | 237.871 | 245.779 |
| 85.83341912900237 | -39.233 | -20.304 | 240.762 | 248.739 |
| 85.99814681354884 | -39.539 | -20.207 | 243.43 | 251.435 |
| 86.17316997837949 | -39.733 | -20.04 | 246.001 | 254.02 |
| 86.33789766292597 | -40.136 | -20.193 | 248.322 | 256.55 |
| 86.50262534747245 | -40.47 | -20.499 | 250.296 | 258.662 |
| 86.66735303201894 | -41.081 | -21.097 | 252.797 | 261.289 |
| 86.83208071656543 | -41.568 | -21.263 | 255.229 | 263.762 |
| 87.00710388139605 | -41.804 | -20.93 | 257.509 | 266.014 |
| 87.17183156594255 | -41.707 | -19.943 | 259.454 | 267.834 |
| 87.33655925048905 | -41.651 | -18.97 | 261.247 | 269.544 |
| 87.50128693503551 | -41.359 | -17.58 | 262.706 | 271.031 |
| 87.666014619582 | -40.762 | -15.968 | 264.04 | 272.059 |
| 87.84103778441263 | -40.317 | -14.287 | 265.097 | 272.865 |
| 88.00576546895913 | -39.525 | -12.355 | 265.736 | 273.282 |
| 88.1704931535056 | -38.677 | -10.59 | 265.75 | 272.977 |
| 88.33522083805208 | -36.717 | -7.491 | 265.736 | 272.379 |
| 88.49994852259859 | -34.688 | -4.614 | 264.888 | 271.059 |
| 88.66467620714505 | -32.395 | -1.459 | 263.123 | 269.03 |
| 88.8396993719757 | -29.935 | 1.89 | 260.858 | 266.639 |
| 89.00442705652219 | -27.656 | 5.17 | 258.704 | 264.527 |
| 89.16915474106867 | -25.446 | 8.575 | 256.633 | 262.748 |
| 89.33388242561514 | -22.889 | 12.647 | 254.465 | 261.219 |
| 89.49861011016162 | -20.179 | 16.622 | 252.686 | 259.718 |
| 89.67363327499227 | -17.692 | 20.29 | 251.449 | 258.773 |
| 89.83836095953876 | -15.829 | 23.001 | 252.394 | 259.913 |
| 90.00308864408524 | -14.398 | 25.113 | 254.131 | 262.053 |
| 90.16781632863173 | -13.258 | 27.045 | 256.035 | 264.43 |
| 90.33254401317821 | -11.896 | 29.115 | 258.509 | 267.112 |
| 90.50756717800884 | -10.215 | 31.714 | 261.511 | 270.364 |
| 90.67229486255535 | -8.811 | 33.896 | 265.055 | 273.963 |
| 90.83702254710182 | -7.143 | 36.37 | 269.308 | 278.119 |
| 91.0017502316483 | -5.17 | 39.302 | 273.435 | 282.288 |
| 91.16647791619478 | -3.127 | 42.332 | 277.702 | 286.61 |
| 91.34150108102543 | -0.625 | 46.098 | 282.052 | 291.155 |
| 91.50622876557192 | 2.21 | 50.309 | 285.846 | 295.352 |
| 91.67095645011838 | 4.197 | 53.422 | 291.627 | 301.355 |
| 91.83568413466487 | 5.698 | 55.924 | 298.798 | 308.61 |
| 92.00041181921137 | 7.255 | 58.648 | 307.234 | 317.088 |
| 92.16513950375784 | 8.283 | 60.204 | 316.99 | 326.593 |
| 92.34016266858848 | 9.992 | 63.498 | 327.761 | 337.489 |
| 92.50489035313497 | 11.466 | 66.792 | 339.087 | 348.885 |
| 92.66961803768146 | 12.744 | 69.571 | 350.97 | 360.768 |
| 92.83434572222792 | 13.258 | 71.42 | 364.02 | 373.692 |
| 92.99907340677441 | 12.98 | 72.379 | 378.084 | 387.521 |
| 93.17409657160506 | 12.689 | 73.629 | 392.788 | 402.113 |
| 93.33882425615154 | 12.313 | 75.464 | 408.562 | 417.942 |
| 93.50355194069803 | 11.007 | 76.687 | 426.295 | 435.509 |
| 93.66827962524452 | 8.617 | 77.007 | 445.682 | 454.535 |
| 93.833007309791 | 6.045 | 77.215 | 465.986 | 474.478 |
| 94.00803047462163 | 3.53 | 77.201 | 487.569 | 495.602 |
| 94.17275815916813 | 0.667 | 76.729 | 509.416 | 516.963 |
| 94.3374858437146 | -2.251 | 76.353 | 532.264 | 539.421 |
| 94.5022135282611 | -5.128 | 76.534 | 555.973 | 562.867 |
| 94.66694121280757 | -7.755 | 77.396 | 580.016 | 586.687 |
| 94.83166889735405 | -10.59 | 78.174 | 605.407 | 611.689 |
| 95.0066920621847 | -13.092 | 79.522 | 629.895 | 635.982 |
| 95.17141974673117 | -15.009 | 82.079 | 652.937 | 659.163 |
| 95.33614743127767 | -16.705 | 85.317 | 674.923 | 681.413 |
| 95.50087511582414 | -19.123 | 87.305 | 698.16 | 704.789 |
| 95.66560280037064 | -20.721 | 90.418 | 719.715 | 726.622 |
| 95.84062596520126 | -23.056 | 93.295 | 742.507 | 749.65 |
| 96.00535364974776 | -25.891 | 95.518 | 766.049 | 773.359 |
| 96.17008133429425 | -28.865 | 97.617 | 790.092 | 797.541 |
| 96.33480901884072 | -31.381 | 100.591 | 813.704 | 821.376 |
| 96.49953670338721 | -33.966 | 102.648 | 837.386 | 845.182 |
| 96.67455986821784 | -36.231 | 104.607 | 859.803 | 867.71 |
| 96.83928755276433 | -37.676 | 106.873 | 878.3 | 886.444 |
| 97.00401523731081 | -39.08 | 108.443 | 896.756 | 905.011 |
| 97.1687429218573 | -40.456 | 109.888 | 914.99 | 923.301 |
| 97.3334706064038 | -41.846 | 111.737 | 933.654 | 942.09 |
| 97.49819829095026 | -43.11 | 113.377 | 951.832 | 960.352 |
| 97.67322145578092 | -44.278 | 114.933 | 969.816 | 978.391 |
| 97.8379491403274 | -44.75 | 116.74 | 986.549 | 995.221 |
| 98.00267682487387 | -44.973 | 118.074 | 1001.516 | 1010.244 |
| 98.16740450942035 | -45.181 | 119.283 | 1015.581 | 1024.364 |
| 98.33213219396683 | -45.529 | 119.492 | 1028.019 | 1036.733 |
| 98.50715535879748 | -46.293 | 120.228 | 1039.999 | 1048.74 |
| 98.67188304334397 | -47.571 | 120.492 | 1053.285 | 1062.026 |
| 98.83661072789045 | -47.863 | 120.173 | 1065.028 | 1073.728 |
| 99.00133841243694 | -48.044 | 119.283 | 1075.924 | 1084.513 |
| 99.16606609698341 | -48.322 | 118.394 | 1086.472 | 1094.95 |
| 99.34108926181405 | -48.753 | 117.56 | 1097.368 | 1105.693 |
| 99.50581694636055 | -49.114 | 116.031 | 1107.638 | 1115.727 |
| 99.67054463090703 | -49.42 | 113.432 | 1116.964 | 1124.691 |
| 99.83527231545351 | -49.892 | 111.056 | 1126.734 | 1134.127 |
| 100.0 | -50.671 | 109.124 | 1137.407 | 1144.564 |